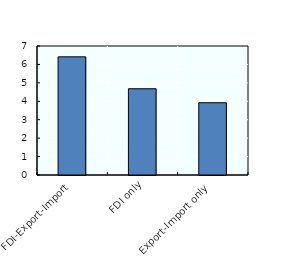
| Category | Prodcuvity premium to domestic firms |
|---|---|
| FDI-Export-Import | 6.412 |
| FDI only | 4.68 |
| Export-Import only | 3.921 |